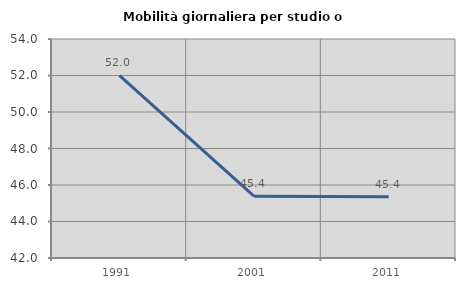
| Category | Mobilità giornaliera per studio o lavoro |
|---|---|
| 1991.0 | 52.013 |
| 2001.0 | 45.388 |
| 2011.0 | 45.361 |